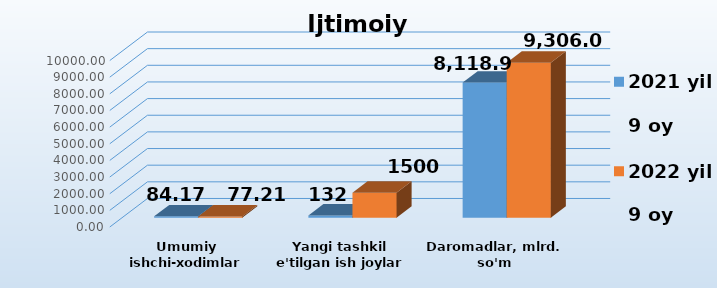
| Category | 2021 yil    
9 oy | 2022 yil    
9 oy |
|---|---|---|
| Umumiy ishchi-xodimlar soni, ming odam | 84.17 | 77.213 |
| Yangi tashkil e'tilgan ish joylar | 132 | 1500 |
| Daromadlar, mlrd. so'm | 8118.854 | 9306 |